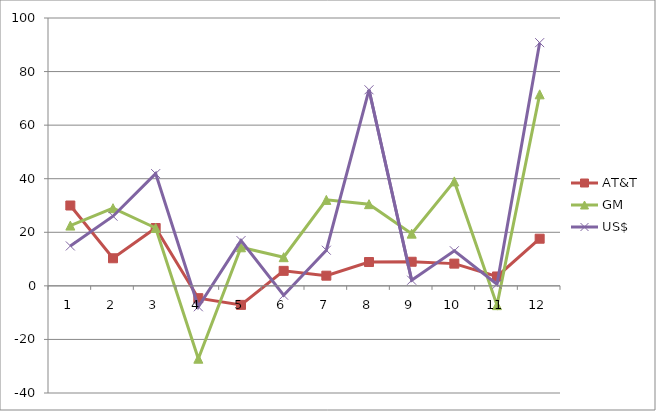
| Category | AT&T | GM | US$ |
|---|---|---|---|
| 1.0 | 30 | 22.5 | 14.9 |
| 2.0 | 10.3 | 29 | 26 |
| 3.0 | 21.6 | 21.6 | 41.9 |
| 4.0 | -4.6 | -27.2 | -7.8 |
| 5.0 | -7.1 | 14.4 | 16.9 |
| 6.0 | 5.6 | 10.7 | -3.5 |
| 7.0 | 3.8 | 32.1 | 13.3 |
| 8.0 | 8.9 | 30.5 | 73.2 |
| 9.0 | 9 | 19.5 | 2.1 |
| 10.0 | 8.3 | 39 | 13.1 |
| 11.0 | 3.5 | -7.2 | 0.6 |
| 12.0 | 17.6 | 71.5 | 90.8 |